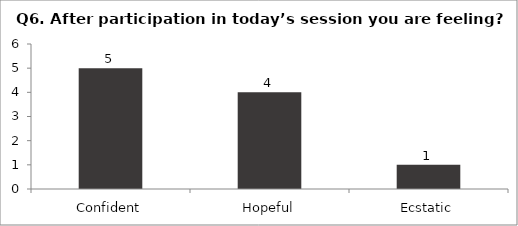
| Category | Q6. After participation in today’s session you are feeling? |
|---|---|
| Confident | 5 |
| Hopeful | 4 |
| Ecstatic | 1 |